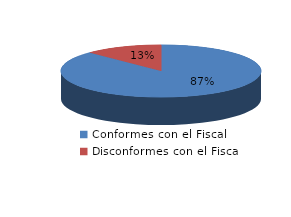
| Category | Series 0 |
|---|---|
| 0 | 2278 |
| 1 | 327 |